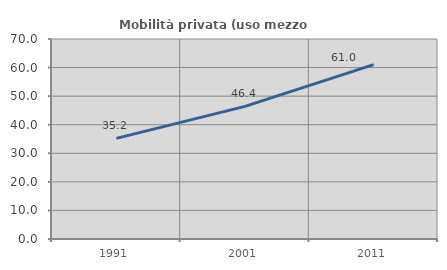
| Category | Mobilità privata (uso mezzo privato) |
|---|---|
| 1991.0 | 35.217 |
| 2001.0 | 46.41 |
| 2011.0 | 61.036 |